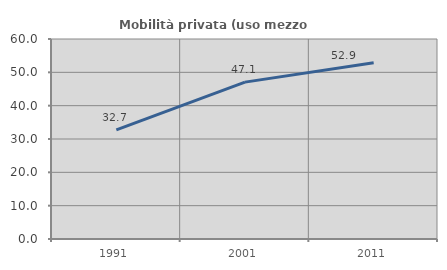
| Category | Mobilità privata (uso mezzo privato) |
|---|---|
| 1991.0 | 32.736 |
| 2001.0 | 47.061 |
| 2011.0 | 52.874 |